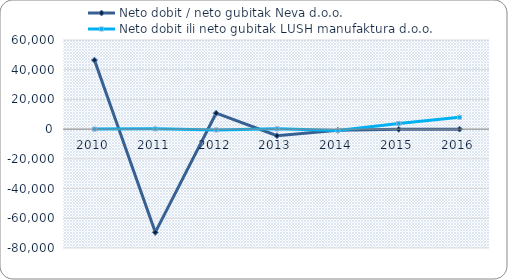
| Category | Neto dobit / neto gubitak Neva d.o.o. | Neto dobit ili neto gubitak LUSH manufaktura d.o.o. |
|---|---|---|
| 2010.0 | 46463 | 51 |
| 2011.0 | -69439 | 199 |
| 2012.0 | 10720 | -535 |
| 2013.0 | -4443 | 210 |
| 2014.0 | -816 | -907 |
| 2015.0 | -127 | 3822 |
| 2016.0 | 0 | 7989 |